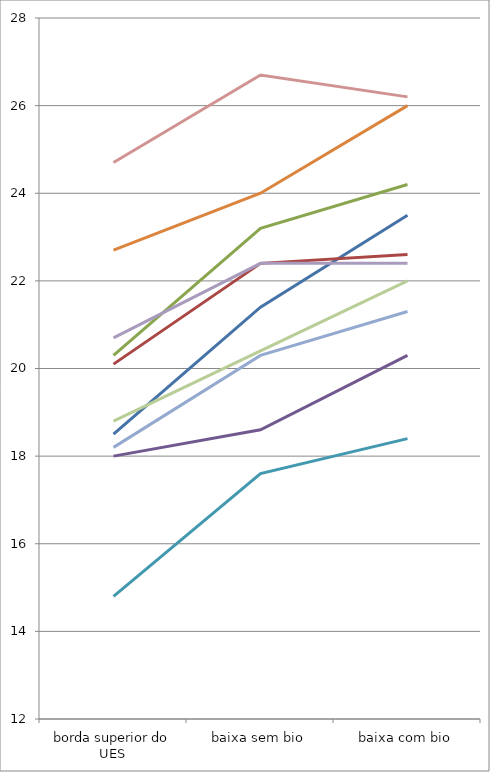
| Category | Series 0 | Series 1 | Series 2 | Series 3 | Series 4 | Series 5 | Series 6 | Series 7 | Series 8 | Series 9 |
|---|---|---|---|---|---|---|---|---|---|---|
| borda superior do UES | 18.5 | 20.1 | 20.3 | 18 | 14.8 | 22.7 | 18.2 | 24.7 | 18.8 | 20.7 |
| baixa sem bio | 21.4 | 22.4 | 23.2 | 18.6 | 17.6 | 24 | 20.3 | 26.7 | 20.4 | 22.4 |
| baixa com bio | 23.5 | 22.6 | 24.2 | 20.3 | 18.4 | 26 | 21.3 | 26.2 | 22 | 22.4 |